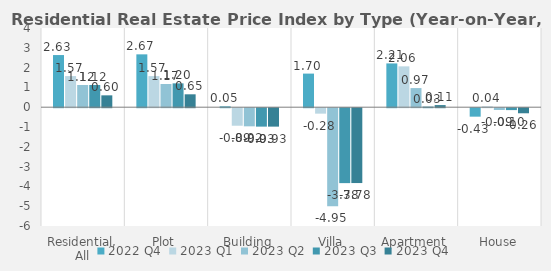
| Category | 2022 | 2023 |
|---|---|---|
| Residential, All | 2.634 | 0.599 |
| Plot | 2.669 | 0.651 |
| Building | 0.046 | -0.931 |
| Villa | 1.697 | -3.78 |
| Apartment | 2.211 | 0.107 |
| House | -0.427 | -0.256 |